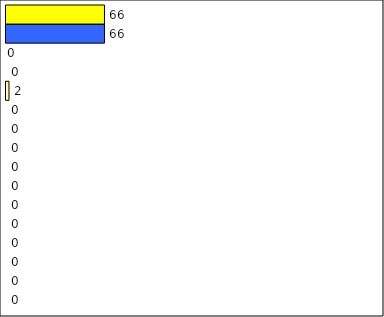
| Category | -2 | -1 | 0 | 1 | 2 | 3 | 4 | 5 | 6 | 7 | 8 | 9 | 10 | 11 | 12 | Perfect Round |
|---|---|---|---|---|---|---|---|---|---|---|---|---|---|---|---|---|
| 0 | 0 | 0 | 0 | 0 | 0 | 0 | 0 | 0 | 0 | 0 | 0 | 2 | 0 | 0 | 66 | 66 |